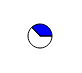
| Category | Series 0 |
|---|---|
| 0 | 5703184 |
| 1 | 3354042 |